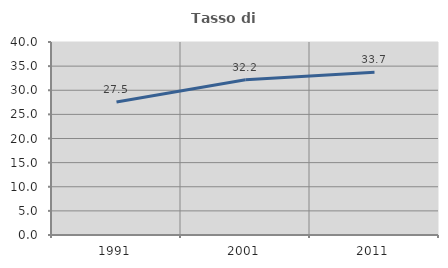
| Category | Tasso di occupazione   |
|---|---|
| 1991.0 | 27.546 |
| 2001.0 | 32.192 |
| 2011.0 | 33.715 |